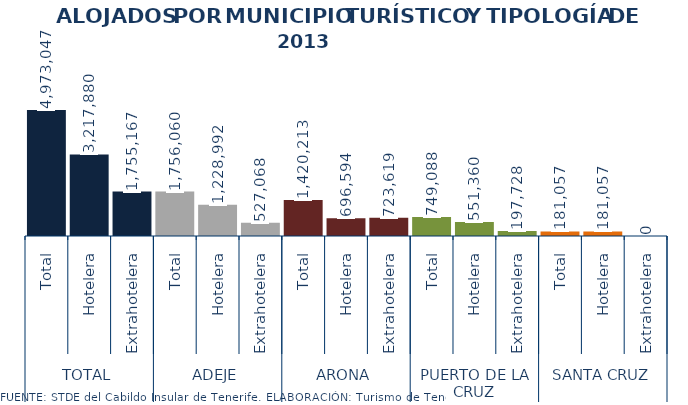
| Category | 2013 |
|---|---|
| 0 | 4973047 |
| 1 | 3217880 |
| 2 | 1755167 |
| 3 | 1756060 |
| 4 | 1228992 |
| 5 | 527068 |
| 6 | 1420213 |
| 7 | 696594 |
| 8 | 723619 |
| 9 | 749088 |
| 10 | 551360 |
| 11 | 197728 |
| 12 | 181057 |
| 13 | 181057 |
| 14 | 0 |